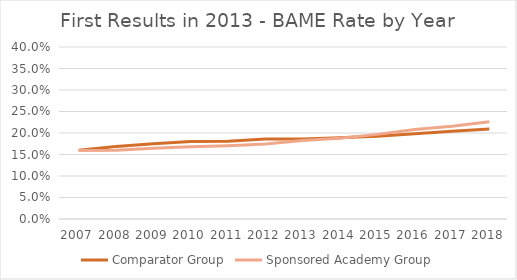
| Category | Comparator Group | Sponsored Academy Group |
|---|---|---|
| 2007.0 | 0.16 | 0.159 |
| 2008.0 | 0.168 | 0.16 |
| 2009.0 | 0.175 | 0.165 |
| 2010.0 | 0.18 | 0.168 |
| 2011.0 | 0.181 | 0.171 |
| 2012.0 | 0.186 | 0.174 |
| 2013.0 | 0.186 | 0.182 |
| 2014.0 | 0.189 | 0.188 |
| 2015.0 | 0.192 | 0.197 |
| 2016.0 | 0.198 | 0.208 |
| 2017.0 | 0.204 | 0.216 |
| 2018.0 | 0.209 | 0.226 |